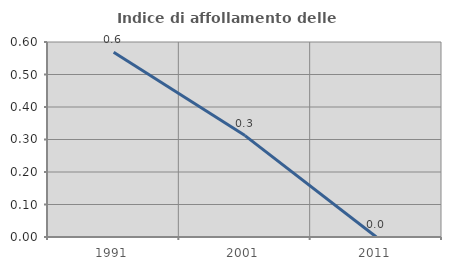
| Category | Indice di affollamento delle abitazioni  |
|---|---|
| 1991.0 | 0.568 |
| 2001.0 | 0.312 |
| 2011.0 | 0 |